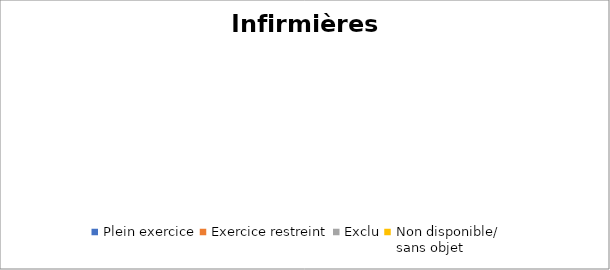
| Category | Infirmières praticiennes |
|---|---|
| Plein exercice | 0 |
| Exercice restreint | 0 |
| Exclu | 0 |
| Non disponible/
sans objet | 0 |